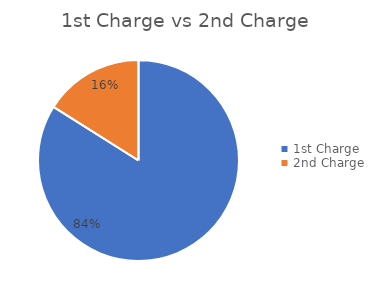
| Category | Series 0 |
|---|---|
| 1st Charge | 0.84 |
| 2nd Charge | 0.16 |